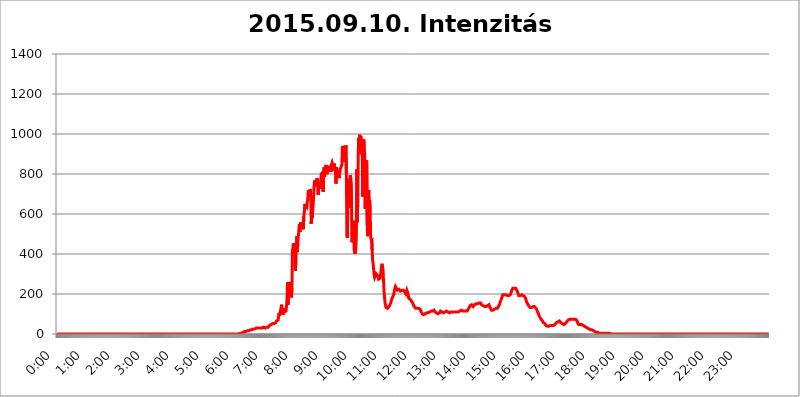
| Category | 2015.09.10. Intenzitás [W/m^2] |
|---|---|
| 0.0 | 0 |
| 0.0006944444444444445 | 0 |
| 0.001388888888888889 | 0 |
| 0.0020833333333333333 | 0 |
| 0.002777777777777778 | 0 |
| 0.003472222222222222 | 0 |
| 0.004166666666666667 | 0 |
| 0.004861111111111111 | 0 |
| 0.005555555555555556 | 0 |
| 0.0062499999999999995 | 0 |
| 0.006944444444444444 | 0 |
| 0.007638888888888889 | 0 |
| 0.008333333333333333 | 0 |
| 0.009027777777777779 | 0 |
| 0.009722222222222222 | 0 |
| 0.010416666666666666 | 0 |
| 0.011111111111111112 | 0 |
| 0.011805555555555555 | 0 |
| 0.012499999999999999 | 0 |
| 0.013194444444444444 | 0 |
| 0.013888888888888888 | 0 |
| 0.014583333333333332 | 0 |
| 0.015277777777777777 | 0 |
| 0.015972222222222224 | 0 |
| 0.016666666666666666 | 0 |
| 0.017361111111111112 | 0 |
| 0.018055555555555557 | 0 |
| 0.01875 | 0 |
| 0.019444444444444445 | 0 |
| 0.02013888888888889 | 0 |
| 0.020833333333333332 | 0 |
| 0.02152777777777778 | 0 |
| 0.022222222222222223 | 0 |
| 0.02291666666666667 | 0 |
| 0.02361111111111111 | 0 |
| 0.024305555555555556 | 0 |
| 0.024999999999999998 | 0 |
| 0.025694444444444447 | 0 |
| 0.02638888888888889 | 0 |
| 0.027083333333333334 | 0 |
| 0.027777777777777776 | 0 |
| 0.02847222222222222 | 0 |
| 0.029166666666666664 | 0 |
| 0.029861111111111113 | 0 |
| 0.030555555555555555 | 0 |
| 0.03125 | 0 |
| 0.03194444444444445 | 0 |
| 0.03263888888888889 | 0 |
| 0.03333333333333333 | 0 |
| 0.034027777777777775 | 0 |
| 0.034722222222222224 | 0 |
| 0.035416666666666666 | 0 |
| 0.036111111111111115 | 0 |
| 0.03680555555555556 | 0 |
| 0.0375 | 0 |
| 0.03819444444444444 | 0 |
| 0.03888888888888889 | 0 |
| 0.03958333333333333 | 0 |
| 0.04027777777777778 | 0 |
| 0.04097222222222222 | 0 |
| 0.041666666666666664 | 0 |
| 0.042361111111111106 | 0 |
| 0.04305555555555556 | 0 |
| 0.043750000000000004 | 0 |
| 0.044444444444444446 | 0 |
| 0.04513888888888889 | 0 |
| 0.04583333333333334 | 0 |
| 0.04652777777777778 | 0 |
| 0.04722222222222222 | 0 |
| 0.04791666666666666 | 0 |
| 0.04861111111111111 | 0 |
| 0.049305555555555554 | 0 |
| 0.049999999999999996 | 0 |
| 0.05069444444444445 | 0 |
| 0.051388888888888894 | 0 |
| 0.052083333333333336 | 0 |
| 0.05277777777777778 | 0 |
| 0.05347222222222222 | 0 |
| 0.05416666666666667 | 0 |
| 0.05486111111111111 | 0 |
| 0.05555555555555555 | 0 |
| 0.05625 | 0 |
| 0.05694444444444444 | 0 |
| 0.057638888888888885 | 0 |
| 0.05833333333333333 | 0 |
| 0.05902777777777778 | 0 |
| 0.059722222222222225 | 0 |
| 0.06041666666666667 | 0 |
| 0.061111111111111116 | 0 |
| 0.06180555555555556 | 0 |
| 0.0625 | 0 |
| 0.06319444444444444 | 0 |
| 0.06388888888888888 | 0 |
| 0.06458333333333334 | 0 |
| 0.06527777777777778 | 0 |
| 0.06597222222222222 | 0 |
| 0.06666666666666667 | 0 |
| 0.06736111111111111 | 0 |
| 0.06805555555555555 | 0 |
| 0.06874999999999999 | 0 |
| 0.06944444444444443 | 0 |
| 0.07013888888888889 | 0 |
| 0.07083333333333333 | 0 |
| 0.07152777777777779 | 0 |
| 0.07222222222222223 | 0 |
| 0.07291666666666667 | 0 |
| 0.07361111111111111 | 0 |
| 0.07430555555555556 | 0 |
| 0.075 | 0 |
| 0.07569444444444444 | 0 |
| 0.0763888888888889 | 0 |
| 0.07708333333333334 | 0 |
| 0.07777777777777778 | 0 |
| 0.07847222222222222 | 0 |
| 0.07916666666666666 | 0 |
| 0.0798611111111111 | 0 |
| 0.08055555555555556 | 0 |
| 0.08125 | 0 |
| 0.08194444444444444 | 0 |
| 0.08263888888888889 | 0 |
| 0.08333333333333333 | 0 |
| 0.08402777777777777 | 0 |
| 0.08472222222222221 | 0 |
| 0.08541666666666665 | 0 |
| 0.08611111111111112 | 0 |
| 0.08680555555555557 | 0 |
| 0.08750000000000001 | 0 |
| 0.08819444444444445 | 0 |
| 0.08888888888888889 | 0 |
| 0.08958333333333333 | 0 |
| 0.09027777777777778 | 0 |
| 0.09097222222222222 | 0 |
| 0.09166666666666667 | 0 |
| 0.09236111111111112 | 0 |
| 0.09305555555555556 | 0 |
| 0.09375 | 0 |
| 0.09444444444444444 | 0 |
| 0.09513888888888888 | 0 |
| 0.09583333333333333 | 0 |
| 0.09652777777777777 | 0 |
| 0.09722222222222222 | 0 |
| 0.09791666666666667 | 0 |
| 0.09861111111111111 | 0 |
| 0.09930555555555555 | 0 |
| 0.09999999999999999 | 0 |
| 0.10069444444444443 | 0 |
| 0.1013888888888889 | 0 |
| 0.10208333333333335 | 0 |
| 0.10277777777777779 | 0 |
| 0.10347222222222223 | 0 |
| 0.10416666666666667 | 0 |
| 0.10486111111111111 | 0 |
| 0.10555555555555556 | 0 |
| 0.10625 | 0 |
| 0.10694444444444444 | 0 |
| 0.1076388888888889 | 0 |
| 0.10833333333333334 | 0 |
| 0.10902777777777778 | 0 |
| 0.10972222222222222 | 0 |
| 0.1111111111111111 | 0 |
| 0.11180555555555556 | 0 |
| 0.11180555555555556 | 0 |
| 0.1125 | 0 |
| 0.11319444444444444 | 0 |
| 0.11388888888888889 | 0 |
| 0.11458333333333333 | 0 |
| 0.11527777777777777 | 0 |
| 0.11597222222222221 | 0 |
| 0.11666666666666665 | 0 |
| 0.1173611111111111 | 0 |
| 0.11805555555555557 | 0 |
| 0.11944444444444445 | 0 |
| 0.12013888888888889 | 0 |
| 0.12083333333333333 | 0 |
| 0.12152777777777778 | 0 |
| 0.12222222222222223 | 0 |
| 0.12291666666666667 | 0 |
| 0.12291666666666667 | 0 |
| 0.12361111111111112 | 0 |
| 0.12430555555555556 | 0 |
| 0.125 | 0 |
| 0.12569444444444444 | 0 |
| 0.12638888888888888 | 0 |
| 0.12708333333333333 | 0 |
| 0.16875 | 0 |
| 0.12847222222222224 | 0 |
| 0.12916666666666668 | 0 |
| 0.12986111111111112 | 0 |
| 0.13055555555555556 | 0 |
| 0.13125 | 0 |
| 0.13194444444444445 | 0 |
| 0.1326388888888889 | 0 |
| 0.13333333333333333 | 0 |
| 0.13402777777777777 | 0 |
| 0.13402777777777777 | 0 |
| 0.13472222222222222 | 0 |
| 0.13541666666666666 | 0 |
| 0.1361111111111111 | 0 |
| 0.13749999999999998 | 0 |
| 0.13819444444444443 | 0 |
| 0.1388888888888889 | 0 |
| 0.13958333333333334 | 0 |
| 0.14027777777777778 | 0 |
| 0.14097222222222222 | 0 |
| 0.14166666666666666 | 0 |
| 0.1423611111111111 | 0 |
| 0.14305555555555557 | 0 |
| 0.14375000000000002 | 0 |
| 0.14444444444444446 | 0 |
| 0.1451388888888889 | 0 |
| 0.1451388888888889 | 0 |
| 0.14652777777777778 | 0 |
| 0.14722222222222223 | 0 |
| 0.14791666666666667 | 0 |
| 0.1486111111111111 | 0 |
| 0.14930555555555555 | 0 |
| 0.15 | 0 |
| 0.15069444444444444 | 0 |
| 0.15138888888888888 | 0 |
| 0.15208333333333332 | 0 |
| 0.15277777777777776 | 0 |
| 0.15347222222222223 | 0 |
| 0.15416666666666667 | 0 |
| 0.15486111111111112 | 0 |
| 0.15555555555555556 | 0 |
| 0.15625 | 0 |
| 0.15694444444444444 | 0 |
| 0.15763888888888888 | 0 |
| 0.15833333333333333 | 0 |
| 0.15902777777777777 | 0 |
| 0.15972222222222224 | 0 |
| 0.16041666666666668 | 0 |
| 0.16111111111111112 | 0 |
| 0.16180555555555556 | 0 |
| 0.1625 | 0 |
| 0.16319444444444445 | 0 |
| 0.1638888888888889 | 0 |
| 0.16458333333333333 | 0 |
| 0.16527777777777777 | 0 |
| 0.16597222222222222 | 0 |
| 0.16666666666666666 | 0 |
| 0.1673611111111111 | 0 |
| 0.16805555555555554 | 0 |
| 0.16874999999999998 | 0 |
| 0.16944444444444443 | 0 |
| 0.17013888888888887 | 0 |
| 0.1708333333333333 | 0 |
| 0.17152777777777775 | 0 |
| 0.17222222222222225 | 0 |
| 0.1729166666666667 | 0 |
| 0.17361111111111113 | 0 |
| 0.17430555555555557 | 0 |
| 0.17500000000000002 | 0 |
| 0.17569444444444446 | 0 |
| 0.1763888888888889 | 0 |
| 0.17708333333333334 | 0 |
| 0.17777777777777778 | 0 |
| 0.17847222222222223 | 0 |
| 0.17916666666666667 | 0 |
| 0.1798611111111111 | 0 |
| 0.18055555555555555 | 0 |
| 0.18125 | 0 |
| 0.18194444444444444 | 0 |
| 0.1826388888888889 | 0 |
| 0.18333333333333335 | 0 |
| 0.1840277777777778 | 0 |
| 0.18472222222222223 | 0 |
| 0.18541666666666667 | 0 |
| 0.18611111111111112 | 0 |
| 0.18680555555555556 | 0 |
| 0.1875 | 0 |
| 0.18819444444444444 | 0 |
| 0.18888888888888888 | 0 |
| 0.18958333333333333 | 0 |
| 0.19027777777777777 | 0 |
| 0.1909722222222222 | 0 |
| 0.19166666666666665 | 0 |
| 0.19236111111111112 | 0 |
| 0.19305555555555554 | 0 |
| 0.19375 | 0 |
| 0.19444444444444445 | 0 |
| 0.1951388888888889 | 0 |
| 0.19583333333333333 | 0 |
| 0.19652777777777777 | 0 |
| 0.19722222222222222 | 0 |
| 0.19791666666666666 | 0 |
| 0.1986111111111111 | 0 |
| 0.19930555555555554 | 0 |
| 0.19999999999999998 | 0 |
| 0.20069444444444443 | 0 |
| 0.20138888888888887 | 0 |
| 0.2020833333333333 | 0 |
| 0.2027777777777778 | 0 |
| 0.2034722222222222 | 0 |
| 0.2041666666666667 | 0 |
| 0.20486111111111113 | 0 |
| 0.20555555555555557 | 0 |
| 0.20625000000000002 | 0 |
| 0.20694444444444446 | 0 |
| 0.2076388888888889 | 0 |
| 0.20833333333333334 | 0 |
| 0.20902777777777778 | 0 |
| 0.20972222222222223 | 0 |
| 0.21041666666666667 | 0 |
| 0.2111111111111111 | 0 |
| 0.21180555555555555 | 0 |
| 0.2125 | 0 |
| 0.21319444444444444 | 0 |
| 0.2138888888888889 | 0 |
| 0.21458333333333335 | 0 |
| 0.2152777777777778 | 0 |
| 0.21597222222222223 | 0 |
| 0.21666666666666667 | 0 |
| 0.21736111111111112 | 0 |
| 0.21805555555555556 | 0 |
| 0.21875 | 0 |
| 0.21944444444444444 | 0 |
| 0.22013888888888888 | 0 |
| 0.22083333333333333 | 0 |
| 0.22152777777777777 | 0 |
| 0.2222222222222222 | 0 |
| 0.22291666666666665 | 0 |
| 0.2236111111111111 | 0 |
| 0.22430555555555556 | 0 |
| 0.225 | 0 |
| 0.22569444444444445 | 0 |
| 0.2263888888888889 | 0 |
| 0.22708333333333333 | 0 |
| 0.22777777777777777 | 0 |
| 0.22847222222222222 | 0 |
| 0.22916666666666666 | 0 |
| 0.2298611111111111 | 0 |
| 0.23055555555555554 | 0 |
| 0.23124999999999998 | 0 |
| 0.23194444444444443 | 0 |
| 0.23263888888888887 | 0 |
| 0.2333333333333333 | 0 |
| 0.2340277777777778 | 0 |
| 0.2347222222222222 | 0 |
| 0.2354166666666667 | 0 |
| 0.23611111111111113 | 0 |
| 0.23680555555555557 | 0 |
| 0.23750000000000002 | 0 |
| 0.23819444444444446 | 0 |
| 0.2388888888888889 | 0 |
| 0.23958333333333334 | 0 |
| 0.24027777777777778 | 0 |
| 0.24097222222222223 | 0 |
| 0.24166666666666667 | 0 |
| 0.2423611111111111 | 0 |
| 0.24305555555555555 | 0 |
| 0.24375 | 0 |
| 0.24444444444444446 | 0 |
| 0.24513888888888888 | 0 |
| 0.24583333333333335 | 0 |
| 0.2465277777777778 | 0 |
| 0.24722222222222223 | 0 |
| 0.24791666666666667 | 0 |
| 0.24861111111111112 | 0 |
| 0.24930555555555556 | 0 |
| 0.25 | 0 |
| 0.25069444444444444 | 0 |
| 0.2513888888888889 | 0 |
| 0.2520833333333333 | 0 |
| 0.25277777777777777 | 0 |
| 0.2534722222222222 | 0 |
| 0.25416666666666665 | 0 |
| 0.2548611111111111 | 0 |
| 0.2555555555555556 | 0 |
| 0.25625000000000003 | 3.525 |
| 0.2569444444444445 | 3.525 |
| 0.2576388888888889 | 3.525 |
| 0.25833333333333336 | 3.525 |
| 0.2590277777777778 | 3.525 |
| 0.25972222222222224 | 7.887 |
| 0.2604166666666667 | 7.887 |
| 0.2611111111111111 | 7.887 |
| 0.26180555555555557 | 7.887 |
| 0.2625 | 12.257 |
| 0.26319444444444445 | 12.257 |
| 0.2638888888888889 | 12.257 |
| 0.26458333333333334 | 12.257 |
| 0.2652777777777778 | 12.257 |
| 0.2659722222222222 | 16.636 |
| 0.26666666666666666 | 16.636 |
| 0.2673611111111111 | 16.636 |
| 0.26805555555555555 | 16.636 |
| 0.26875 | 16.636 |
| 0.26944444444444443 | 16.636 |
| 0.2701388888888889 | 21.024 |
| 0.2708333333333333 | 21.024 |
| 0.27152777777777776 | 21.024 |
| 0.2722222222222222 | 21.024 |
| 0.27291666666666664 | 21.024 |
| 0.2736111111111111 | 21.024 |
| 0.2743055555555555 | 21.024 |
| 0.27499999999999997 | 25.419 |
| 0.27569444444444446 | 25.419 |
| 0.27638888888888885 | 25.419 |
| 0.27708333333333335 | 25.419 |
| 0.2777777777777778 | 25.419 |
| 0.27847222222222223 | 25.419 |
| 0.2791666666666667 | 29.823 |
| 0.2798611111111111 | 29.823 |
| 0.28055555555555556 | 29.823 |
| 0.28125 | 29.823 |
| 0.28194444444444444 | 29.823 |
| 0.2826388888888889 | 29.823 |
| 0.2833333333333333 | 29.823 |
| 0.28402777777777777 | 29.823 |
| 0.2847222222222222 | 29.823 |
| 0.28541666666666665 | 29.823 |
| 0.28611111111111115 | 29.823 |
| 0.28680555555555554 | 29.823 |
| 0.28750000000000003 | 29.823 |
| 0.2881944444444445 | 29.823 |
| 0.2888888888888889 | 29.823 |
| 0.28958333333333336 | 34.234 |
| 0.2902777777777778 | 34.234 |
| 0.29097222222222224 | 29.823 |
| 0.2916666666666667 | 29.823 |
| 0.2923611111111111 | 34.234 |
| 0.29305555555555557 | 34.234 |
| 0.29375 | 34.234 |
| 0.29444444444444445 | 34.234 |
| 0.2951388888888889 | 34.234 |
| 0.29583333333333334 | 34.234 |
| 0.2965277777777778 | 38.653 |
| 0.2972222222222222 | 38.653 |
| 0.29791666666666666 | 43.079 |
| 0.2986111111111111 | 47.511 |
| 0.29930555555555555 | 47.511 |
| 0.3 | 47.511 |
| 0.30069444444444443 | 51.951 |
| 0.3013888888888889 | 47.511 |
| 0.3020833333333333 | 51.951 |
| 0.30277777777777776 | 51.951 |
| 0.3034722222222222 | 51.951 |
| 0.30416666666666664 | 51.951 |
| 0.3048611111111111 | 56.398 |
| 0.3055555555555555 | 56.398 |
| 0.30624999999999997 | 56.398 |
| 0.3069444444444444 | 56.398 |
| 0.3076388888888889 | 65.31 |
| 0.30833333333333335 | 65.31 |
| 0.3090277777777778 | 65.31 |
| 0.30972222222222223 | 69.775 |
| 0.3104166666666667 | 87.692 |
| 0.3111111111111111 | 105.69 |
| 0.31180555555555556 | 92.184 |
| 0.3125 | 96.682 |
| 0.31319444444444444 | 114.716 |
| 0.3138888888888889 | 110.201 |
| 0.3145833333333333 | 146.423 |
| 0.31527777777777777 | 123.758 |
| 0.3159722222222222 | 114.716 |
| 0.31666666666666665 | 96.682 |
| 0.31736111111111115 | 96.682 |
| 0.31805555555555554 | 128.284 |
| 0.31875000000000003 | 110.201 |
| 0.3194444444444445 | 105.69 |
| 0.3201388888888889 | 110.201 |
| 0.32083333333333336 | 114.716 |
| 0.3215277777777778 | 137.347 |
| 0.32222222222222224 | 169.156 |
| 0.3229166666666667 | 260.373 |
| 0.3236111111111111 | 146.423 |
| 0.32430555555555557 | 173.709 |
| 0.325 | 210.182 |
| 0.32569444444444445 | 219.309 |
| 0.3263888888888889 | 233 |
| 0.32708333333333334 | 260.373 |
| 0.3277777777777778 | 223.873 |
| 0.3284722222222222 | 182.82 |
| 0.32916666666666666 | 228.436 |
| 0.3298611111111111 | 422.943 |
| 0.33055555555555555 | 409.574 |
| 0.33125 | 453.968 |
| 0.33194444444444443 | 405.108 |
| 0.3326388888888889 | 422.943 |
| 0.3333333333333333 | 409.574 |
| 0.3340277777777778 | 314.98 |
| 0.3347222222222222 | 378.224 |
| 0.3354166666666667 | 378.224 |
| 0.3361111111111111 | 489.108 |
| 0.3368055555555556 | 409.574 |
| 0.33749999999999997 | 471.582 |
| 0.33819444444444446 | 489.108 |
| 0.33888888888888885 | 484.735 |
| 0.33958333333333335 | 549.704 |
| 0.34027777777777773 | 510.885 |
| 0.34097222222222223 | 549.704 |
| 0.3416666666666666 | 558.261 |
| 0.3423611111111111 | 532.513 |
| 0.3430555555555555 | 532.513 |
| 0.34375 | 528.2 |
| 0.3444444444444445 | 549.704 |
| 0.3451388888888889 | 523.88 |
| 0.3458333333333334 | 588.009 |
| 0.34652777777777777 | 609.062 |
| 0.34722222222222227 | 650.667 |
| 0.34791666666666665 | 642.4 |
| 0.34861111111111115 | 642.4 |
| 0.34930555555555554 | 638.256 |
| 0.35000000000000003 | 634.105 |
| 0.3506944444444444 | 658.909 |
| 0.3513888888888889 | 675.311 |
| 0.3520833333333333 | 719.877 |
| 0.3527777777777778 | 711.832 |
| 0.3534722222222222 | 715.858 |
| 0.3541666666666667 | 687.544 |
| 0.3548611111111111 | 723.889 |
| 0.35555555555555557 | 699.717 |
| 0.35625 | 549.704 |
| 0.35694444444444445 | 613.252 |
| 0.3576388888888889 | 579.542 |
| 0.35833333333333334 | 621.613 |
| 0.3590277777777778 | 650.667 |
| 0.3597222222222222 | 699.717 |
| 0.36041666666666666 | 751.803 |
| 0.3611111111111111 | 767.62 |
| 0.36180555555555555 | 767.62 |
| 0.3625 | 735.89 |
| 0.36319444444444443 | 763.674 |
| 0.3638888888888889 | 771.559 |
| 0.3645833333333333 | 779.42 |
| 0.3652777777777778 | 759.723 |
| 0.3659722222222222 | 695.666 |
| 0.3666666666666667 | 759.723 |
| 0.3673611111111111 | 727.896 |
| 0.3680555555555556 | 759.723 |
| 0.36874999999999997 | 727.896 |
| 0.36944444444444446 | 751.803 |
| 0.37013888888888885 | 795.074 |
| 0.37083333333333335 | 806.757 |
| 0.37152777777777773 | 798.974 |
| 0.37222222222222223 | 810.641 |
| 0.3729166666666666 | 711.832 |
| 0.3736111111111111 | 814.519 |
| 0.3743055555555555 | 833.834 |
| 0.375 | 787.258 |
| 0.3756944444444445 | 826.123 |
| 0.3763888888888889 | 837.682 |
| 0.3770833333333334 | 845.365 |
| 0.37777777777777777 | 829.981 |
| 0.37847222222222227 | 798.974 |
| 0.37916666666666665 | 826.123 |
| 0.37986111111111115 | 810.641 |
| 0.38055555555555554 | 833.834 |
| 0.38125000000000003 | 833.834 |
| 0.3819444444444444 | 837.682 |
| 0.3826388888888889 | 837.682 |
| 0.3833333333333333 | 833.834 |
| 0.3840277777777778 | 810.641 |
| 0.3847222222222222 | 849.199 |
| 0.3854166666666667 | 856.855 |
| 0.3861111111111111 | 853.029 |
| 0.38680555555555557 | 837.682 |
| 0.3875 | 833.834 |
| 0.38819444444444445 | 853.029 |
| 0.3888888888888889 | 849.199 |
| 0.38958333333333334 | 849.199 |
| 0.3902777777777778 | 810.641 |
| 0.3909722222222222 | 751.803 |
| 0.39166666666666666 | 833.834 |
| 0.3923611111111111 | 822.26 |
| 0.39305555555555555 | 810.641 |
| 0.39375 | 783.342 |
| 0.39444444444444443 | 802.868 |
| 0.3951388888888889 | 779.42 |
| 0.3958333333333333 | 783.342 |
| 0.3965277777777778 | 818.392 |
| 0.3972222222222222 | 814.519 |
| 0.3979166666666667 | 833.834 |
| 0.3986111111111111 | 837.682 |
| 0.3993055555555556 | 849.199 |
| 0.39999999999999997 | 940.082 |
| 0.40069444444444446 | 943.832 |
| 0.40138888888888885 | 925.06 |
| 0.40208333333333335 | 879.719 |
| 0.40277777777777773 | 860.676 |
| 0.40347222222222223 | 887.309 |
| 0.4041666666666666 | 921.298 |
| 0.4048611111111111 | 943.832 |
| 0.4055555555555555 | 798.974 |
| 0.40625 | 489.108 |
| 0.4069444444444445 | 480.356 |
| 0.4076388888888889 | 775.492 |
| 0.4083333333333334 | 751.803 |
| 0.40902777777777777 | 629.948 |
| 0.40972222222222227 | 667.123 |
| 0.41041666666666665 | 759.723 |
| 0.41111111111111115 | 795.074 |
| 0.41180555555555554 | 771.559 |
| 0.41250000000000003 | 747.834 |
| 0.4131944444444444 | 458.38 |
| 0.4138888888888889 | 453.968 |
| 0.4145833333333333 | 458.38 |
| 0.4152777777777778 | 480.356 |
| 0.4159722222222222 | 566.793 |
| 0.4166666666666667 | 418.492 |
| 0.4173611111111111 | 400.638 |
| 0.41805555555555557 | 405.108 |
| 0.41875 | 422.943 |
| 0.41944444444444445 | 484.735 |
| 0.4201388888888889 | 822.26 |
| 0.42083333333333334 | 558.261 |
| 0.4215277777777778 | 675.311 |
| 0.4222222222222222 | 909.996 |
| 0.42291666666666666 | 981.244 |
| 0.4236111111111111 | 909.996 |
| 0.42430555555555555 | 996.182 |
| 0.425 | 909.996 |
| 0.42569444444444443 | 988.714 |
| 0.4263888888888889 | 898.668 |
| 0.4270833333333333 | 970.034 |
| 0.4277777777777778 | 951.327 |
| 0.4284722222222222 | 687.544 |
| 0.4291666666666667 | 958.814 |
| 0.4298611111111111 | 973.772 |
| 0.4305555555555556 | 932.576 |
| 0.43124999999999997 | 894.885 |
| 0.43194444444444446 | 625.784 |
| 0.43263888888888885 | 849.199 |
| 0.43333333333333335 | 845.365 |
| 0.43402777777777773 | 868.305 |
| 0.43472222222222223 | 545.416 |
| 0.4354166666666666 | 489.108 |
| 0.4361111111111111 | 489.108 |
| 0.4368055555555555 | 719.877 |
| 0.4375 | 629.948 |
| 0.4381944444444445 | 667.123 |
| 0.4388888888888889 | 609.062 |
| 0.4395833333333334 | 484.735 |
| 0.44027777777777777 | 471.582 |
| 0.44097222222222227 | 480.356 |
| 0.44166666666666665 | 418.492 |
| 0.44236111111111115 | 369.23 |
| 0.44305555555555554 | 351.198 |
| 0.44375000000000003 | 324.052 |
| 0.4444444444444444 | 296.808 |
| 0.4451388888888889 | 283.156 |
| 0.4458333333333333 | 278.603 |
| 0.4465277777777778 | 287.709 |
| 0.4472222222222222 | 301.354 |
| 0.4479166666666667 | 301.354 |
| 0.4486111111111111 | 301.354 |
| 0.44930555555555557 | 292.259 |
| 0.45 | 287.709 |
| 0.45069444444444445 | 274.047 |
| 0.4513888888888889 | 274.047 |
| 0.45208333333333334 | 274.047 |
| 0.4527777777777778 | 278.603 |
| 0.4534722222222222 | 296.808 |
| 0.45416666666666666 | 314.98 |
| 0.4548611111111111 | 337.639 |
| 0.45555555555555555 | 351.198 |
| 0.45625 | 351.198 |
| 0.45694444444444443 | 314.98 |
| 0.4576388888888889 | 264.932 |
| 0.4583333333333333 | 214.746 |
| 0.4590277777777778 | 182.82 |
| 0.4597222222222222 | 160.056 |
| 0.4604166666666667 | 146.423 |
| 0.4611111111111111 | 132.814 |
| 0.4618055555555556 | 128.284 |
| 0.46249999999999997 | 128.284 |
| 0.46319444444444446 | 128.284 |
| 0.46388888888888885 | 128.284 |
| 0.46458333333333335 | 132.814 |
| 0.46527777777777773 | 137.347 |
| 0.46597222222222223 | 141.884 |
| 0.4666666666666666 | 146.423 |
| 0.4673611111111111 | 150.964 |
| 0.4680555555555555 | 160.056 |
| 0.46875 | 169.156 |
| 0.4694444444444445 | 178.264 |
| 0.4701388888888889 | 182.82 |
| 0.4708333333333334 | 187.378 |
| 0.47152777777777777 | 191.937 |
| 0.47222222222222227 | 201.058 |
| 0.47291666666666665 | 219.309 |
| 0.47361111111111115 | 228.436 |
| 0.47430555555555554 | 237.564 |
| 0.47500000000000003 | 233 |
| 0.4756944444444444 | 228.436 |
| 0.4763888888888889 | 228.436 |
| 0.4770833333333333 | 219.309 |
| 0.4777777777777778 | 214.746 |
| 0.4784722222222222 | 219.309 |
| 0.4791666666666667 | 223.873 |
| 0.4798611111111111 | 223.873 |
| 0.48055555555555557 | 219.309 |
| 0.48125 | 214.746 |
| 0.48194444444444445 | 214.746 |
| 0.4826388888888889 | 219.309 |
| 0.48333333333333334 | 219.309 |
| 0.4840277777777778 | 219.309 |
| 0.4847222222222222 | 219.309 |
| 0.48541666666666666 | 219.309 |
| 0.4861111111111111 | 219.309 |
| 0.48680555555555555 | 219.309 |
| 0.4875 | 210.182 |
| 0.48819444444444443 | 205.62 |
| 0.4888888888888889 | 201.058 |
| 0.4895833333333333 | 210.182 |
| 0.4902777777777778 | 219.309 |
| 0.4909722222222222 | 214.746 |
| 0.4916666666666667 | 205.62 |
| 0.4923611111111111 | 191.937 |
| 0.4930555555555556 | 178.264 |
| 0.49374999999999997 | 173.709 |
| 0.49444444444444446 | 173.709 |
| 0.49513888888888885 | 173.709 |
| 0.49583333333333335 | 169.156 |
| 0.49652777777777773 | 164.605 |
| 0.49722222222222223 | 164.605 |
| 0.4979166666666666 | 160.056 |
| 0.4986111111111111 | 155.509 |
| 0.4993055555555555 | 146.423 |
| 0.5 | 141.884 |
| 0.5006944444444444 | 137.347 |
| 0.5013888888888889 | 137.347 |
| 0.5020833333333333 | 132.814 |
| 0.5027777777777778 | 128.284 |
| 0.5034722222222222 | 128.284 |
| 0.5041666666666667 | 128.284 |
| 0.5048611111111111 | 128.284 |
| 0.5055555555555555 | 128.284 |
| 0.50625 | 128.284 |
| 0.5069444444444444 | 128.284 |
| 0.5076388888888889 | 128.284 |
| 0.5083333333333333 | 128.284 |
| 0.5090277777777777 | 123.758 |
| 0.5097222222222222 | 119.235 |
| 0.5104166666666666 | 110.201 |
| 0.5111111111111112 | 105.69 |
| 0.5118055555555555 | 101.184 |
| 0.5125000000000001 | 96.682 |
| 0.5131944444444444 | 96.682 |
| 0.513888888888889 | 96.682 |
| 0.5145833333333333 | 96.682 |
| 0.5152777777777778 | 101.184 |
| 0.5159722222222222 | 101.184 |
| 0.5166666666666667 | 105.69 |
| 0.517361111111111 | 105.69 |
| 0.5180555555555556 | 105.69 |
| 0.5187499999999999 | 105.69 |
| 0.5194444444444445 | 105.69 |
| 0.5201388888888888 | 105.69 |
| 0.5208333333333334 | 105.69 |
| 0.5215277777777778 | 110.201 |
| 0.5222222222222223 | 110.201 |
| 0.5229166666666667 | 110.201 |
| 0.5236111111111111 | 114.716 |
| 0.5243055555555556 | 114.716 |
| 0.525 | 110.201 |
| 0.5256944444444445 | 110.201 |
| 0.5263888888888889 | 114.716 |
| 0.5270833333333333 | 114.716 |
| 0.5277777777777778 | 119.235 |
| 0.5284722222222222 | 119.235 |
| 0.5291666666666667 | 114.716 |
| 0.5298611111111111 | 110.201 |
| 0.5305555555555556 | 110.201 |
| 0.53125 | 110.201 |
| 0.5319444444444444 | 105.69 |
| 0.5326388888888889 | 105.69 |
| 0.5333333333333333 | 101.184 |
| 0.5340277777777778 | 101.184 |
| 0.5347222222222222 | 101.184 |
| 0.5354166666666667 | 101.184 |
| 0.5361111111111111 | 105.69 |
| 0.5368055555555555 | 110.201 |
| 0.5375 | 114.716 |
| 0.5381944444444444 | 114.716 |
| 0.5388888888888889 | 110.201 |
| 0.5395833333333333 | 110.201 |
| 0.5402777777777777 | 105.69 |
| 0.5409722222222222 | 105.69 |
| 0.5416666666666666 | 105.69 |
| 0.5423611111111112 | 105.69 |
| 0.5430555555555555 | 110.201 |
| 0.5437500000000001 | 110.201 |
| 0.5444444444444444 | 110.201 |
| 0.545138888888889 | 110.201 |
| 0.5458333333333333 | 114.716 |
| 0.5465277777777778 | 114.716 |
| 0.5472222222222222 | 114.716 |
| 0.5479166666666667 | 110.201 |
| 0.548611111111111 | 105.69 |
| 0.5493055555555556 | 105.69 |
| 0.5499999999999999 | 105.69 |
| 0.5506944444444445 | 110.201 |
| 0.5513888888888888 | 110.201 |
| 0.5520833333333334 | 110.201 |
| 0.5527777777777778 | 114.716 |
| 0.5534722222222223 | 114.716 |
| 0.5541666666666667 | 110.201 |
| 0.5548611111111111 | 110.201 |
| 0.5555555555555556 | 110.201 |
| 0.55625 | 110.201 |
| 0.5569444444444445 | 110.201 |
| 0.5576388888888889 | 110.201 |
| 0.5583333333333333 | 110.201 |
| 0.5590277777777778 | 110.201 |
| 0.5597222222222222 | 110.201 |
| 0.5604166666666667 | 110.201 |
| 0.5611111111111111 | 110.201 |
| 0.5618055555555556 | 110.201 |
| 0.5625 | 110.201 |
| 0.5631944444444444 | 110.201 |
| 0.5638888888888889 | 114.716 |
| 0.5645833333333333 | 114.716 |
| 0.5652777777777778 | 114.716 |
| 0.5659722222222222 | 119.235 |
| 0.5666666666666667 | 119.235 |
| 0.5673611111111111 | 119.235 |
| 0.5680555555555555 | 119.235 |
| 0.56875 | 114.716 |
| 0.5694444444444444 | 114.716 |
| 0.5701388888888889 | 114.716 |
| 0.5708333333333333 | 114.716 |
| 0.5715277777777777 | 114.716 |
| 0.5722222222222222 | 114.716 |
| 0.5729166666666666 | 114.716 |
| 0.5736111111111112 | 114.716 |
| 0.5743055555555555 | 114.716 |
| 0.5750000000000001 | 114.716 |
| 0.5756944444444444 | 119.235 |
| 0.576388888888889 | 123.758 |
| 0.5770833333333333 | 128.284 |
| 0.5777777777777778 | 132.814 |
| 0.5784722222222222 | 137.347 |
| 0.5791666666666667 | 141.884 |
| 0.579861111111111 | 141.884 |
| 0.5805555555555556 | 146.423 |
| 0.5812499999999999 | 146.423 |
| 0.5819444444444445 | 146.423 |
| 0.5826388888888888 | 141.884 |
| 0.5833333333333334 | 137.347 |
| 0.5840277777777778 | 137.347 |
| 0.5847222222222223 | 141.884 |
| 0.5854166666666667 | 146.423 |
| 0.5861111111111111 | 146.423 |
| 0.5868055555555556 | 150.964 |
| 0.5875 | 150.964 |
| 0.5881944444444445 | 150.964 |
| 0.5888888888888889 | 150.964 |
| 0.5895833333333333 | 150.964 |
| 0.5902777777777778 | 146.423 |
| 0.5909722222222222 | 150.964 |
| 0.5916666666666667 | 155.509 |
| 0.5923611111111111 | 160.056 |
| 0.5930555555555556 | 155.509 |
| 0.59375 | 155.509 |
| 0.5944444444444444 | 150.964 |
| 0.5951388888888889 | 146.423 |
| 0.5958333333333333 | 141.884 |
| 0.5965277777777778 | 141.884 |
| 0.5972222222222222 | 141.884 |
| 0.5979166666666667 | 141.884 |
| 0.5986111111111111 | 137.347 |
| 0.5993055555555555 | 137.347 |
| 0.6 | 137.347 |
| 0.6006944444444444 | 137.347 |
| 0.6013888888888889 | 137.347 |
| 0.6020833333333333 | 137.347 |
| 0.6027777777777777 | 137.347 |
| 0.6034722222222222 | 141.884 |
| 0.6041666666666666 | 146.423 |
| 0.6048611111111112 | 146.423 |
| 0.6055555555555555 | 146.423 |
| 0.6062500000000001 | 137.347 |
| 0.6069444444444444 | 137.347 |
| 0.607638888888889 | 128.284 |
| 0.6083333333333333 | 123.758 |
| 0.6090277777777778 | 119.235 |
| 0.6097222222222222 | 119.235 |
| 0.6104166666666667 | 119.235 |
| 0.611111111111111 | 119.235 |
| 0.6118055555555556 | 119.235 |
| 0.6124999999999999 | 123.758 |
| 0.6131944444444445 | 123.758 |
| 0.6138888888888888 | 128.284 |
| 0.6145833333333334 | 128.284 |
| 0.6152777777777778 | 128.284 |
| 0.6159722222222223 | 128.284 |
| 0.6166666666666667 | 128.284 |
| 0.6173611111111111 | 128.284 |
| 0.6180555555555556 | 132.814 |
| 0.61875 | 137.347 |
| 0.6194444444444445 | 141.884 |
| 0.6201388888888889 | 146.423 |
| 0.6208333333333333 | 155.509 |
| 0.6215277777777778 | 160.056 |
| 0.6222222222222222 | 169.156 |
| 0.6229166666666667 | 173.709 |
| 0.6236111111111111 | 182.82 |
| 0.6243055555555556 | 187.378 |
| 0.625 | 196.497 |
| 0.6256944444444444 | 196.497 |
| 0.6263888888888889 | 201.058 |
| 0.6270833333333333 | 196.497 |
| 0.6277777777777778 | 196.497 |
| 0.6284722222222222 | 196.497 |
| 0.6291666666666667 | 196.497 |
| 0.6298611111111111 | 196.497 |
| 0.6305555555555555 | 191.937 |
| 0.63125 | 191.937 |
| 0.6319444444444444 | 187.378 |
| 0.6326388888888889 | 191.937 |
| 0.6333333333333333 | 191.937 |
| 0.6340277777777777 | 191.937 |
| 0.6347222222222222 | 191.937 |
| 0.6354166666666666 | 196.497 |
| 0.6361111111111112 | 201.058 |
| 0.6368055555555555 | 210.182 |
| 0.6375000000000001 | 219.309 |
| 0.6381944444444444 | 223.873 |
| 0.638888888888889 | 228.436 |
| 0.6395833333333333 | 228.436 |
| 0.6402777777777778 | 228.436 |
| 0.6409722222222222 | 228.436 |
| 0.6416666666666667 | 228.436 |
| 0.642361111111111 | 228.436 |
| 0.6430555555555556 | 228.436 |
| 0.6437499999999999 | 228.436 |
| 0.6444444444444445 | 223.873 |
| 0.6451388888888888 | 214.746 |
| 0.6458333333333334 | 210.182 |
| 0.6465277777777778 | 201.058 |
| 0.6472222222222223 | 191.937 |
| 0.6479166666666667 | 191.937 |
| 0.6486111111111111 | 187.378 |
| 0.6493055555555556 | 191.937 |
| 0.65 | 191.937 |
| 0.6506944444444445 | 191.937 |
| 0.6513888888888889 | 196.497 |
| 0.6520833333333333 | 196.497 |
| 0.6527777777777778 | 196.497 |
| 0.6534722222222222 | 191.937 |
| 0.6541666666666667 | 191.937 |
| 0.6548611111111111 | 191.937 |
| 0.6555555555555556 | 187.378 |
| 0.65625 | 182.82 |
| 0.6569444444444444 | 178.264 |
| 0.6576388888888889 | 169.156 |
| 0.6583333333333333 | 160.056 |
| 0.6590277777777778 | 155.509 |
| 0.6597222222222222 | 150.964 |
| 0.6604166666666667 | 146.423 |
| 0.6611111111111111 | 141.884 |
| 0.6618055555555555 | 137.347 |
| 0.6625 | 137.347 |
| 0.6631944444444444 | 132.814 |
| 0.6638888888888889 | 132.814 |
| 0.6645833333333333 | 132.814 |
| 0.6652777777777777 | 132.814 |
| 0.6659722222222222 | 132.814 |
| 0.6666666666666666 | 137.347 |
| 0.6673611111111111 | 137.347 |
| 0.6680555555555556 | 141.884 |
| 0.6687500000000001 | 137.347 |
| 0.6694444444444444 | 137.347 |
| 0.6701388888888888 | 137.347 |
| 0.6708333333333334 | 132.814 |
| 0.6715277777777778 | 128.284 |
| 0.6722222222222222 | 123.758 |
| 0.6729166666666666 | 119.235 |
| 0.6736111111111112 | 110.201 |
| 0.6743055555555556 | 105.69 |
| 0.6749999999999999 | 101.184 |
| 0.6756944444444444 | 92.184 |
| 0.6763888888888889 | 87.692 |
| 0.6770833333333334 | 83.205 |
| 0.6777777777777777 | 78.722 |
| 0.6784722222222223 | 74.246 |
| 0.6791666666666667 | 74.246 |
| 0.6798611111111111 | 69.775 |
| 0.6805555555555555 | 65.31 |
| 0.68125 | 60.85 |
| 0.6819444444444445 | 56.398 |
| 0.6826388888888889 | 56.398 |
| 0.6833333333333332 | 51.951 |
| 0.6840277777777778 | 51.951 |
| 0.6847222222222222 | 47.511 |
| 0.6854166666666667 | 43.079 |
| 0.686111111111111 | 38.653 |
| 0.6868055555555556 | 38.653 |
| 0.6875 | 38.653 |
| 0.6881944444444444 | 38.653 |
| 0.688888888888889 | 38.653 |
| 0.6895833333333333 | 38.653 |
| 0.6902777777777778 | 38.653 |
| 0.6909722222222222 | 43.079 |
| 0.6916666666666668 | 43.079 |
| 0.6923611111111111 | 43.079 |
| 0.6930555555555555 | 43.079 |
| 0.69375 | 43.079 |
| 0.6944444444444445 | 43.079 |
| 0.6951388888888889 | 43.079 |
| 0.6958333333333333 | 43.079 |
| 0.6965277777777777 | 43.079 |
| 0.6972222222222223 | 47.511 |
| 0.6979166666666666 | 47.511 |
| 0.6986111111111111 | 51.951 |
| 0.6993055555555556 | 51.951 |
| 0.7000000000000001 | 56.398 |
| 0.7006944444444444 | 56.398 |
| 0.7013888888888888 | 60.85 |
| 0.7020833333333334 | 60.85 |
| 0.7027777777777778 | 65.31 |
| 0.7034722222222222 | 65.31 |
| 0.7041666666666666 | 65.31 |
| 0.7048611111111112 | 65.31 |
| 0.7055555555555556 | 60.85 |
| 0.7062499999999999 | 56.398 |
| 0.7069444444444444 | 56.398 |
| 0.7076388888888889 | 51.951 |
| 0.7083333333333334 | 51.951 |
| 0.7090277777777777 | 47.511 |
| 0.7097222222222223 | 47.511 |
| 0.7104166666666667 | 47.511 |
| 0.7111111111111111 | 47.511 |
| 0.7118055555555555 | 47.511 |
| 0.7125 | 51.951 |
| 0.7131944444444445 | 56.398 |
| 0.7138888888888889 | 56.398 |
| 0.7145833333333332 | 60.85 |
| 0.7152777777777778 | 65.31 |
| 0.7159722222222222 | 65.31 |
| 0.7166666666666667 | 69.775 |
| 0.717361111111111 | 74.246 |
| 0.7180555555555556 | 74.246 |
| 0.71875 | 74.246 |
| 0.7194444444444444 | 74.246 |
| 0.720138888888889 | 74.246 |
| 0.7208333333333333 | 74.246 |
| 0.7215277777777778 | 74.246 |
| 0.7222222222222222 | 74.246 |
| 0.7229166666666668 | 74.246 |
| 0.7236111111111111 | 74.246 |
| 0.7243055555555555 | 74.246 |
| 0.725 | 74.246 |
| 0.7256944444444445 | 78.722 |
| 0.7263888888888889 | 74.246 |
| 0.7270833333333333 | 74.246 |
| 0.7277777777777777 | 74.246 |
| 0.7284722222222223 | 69.775 |
| 0.7291666666666666 | 65.31 |
| 0.7298611111111111 | 56.398 |
| 0.7305555555555556 | 51.951 |
| 0.7312500000000001 | 47.511 |
| 0.7319444444444444 | 43.079 |
| 0.7326388888888888 | 43.079 |
| 0.7333333333333334 | 47.511 |
| 0.7340277777777778 | 47.511 |
| 0.7347222222222222 | 47.511 |
| 0.7354166666666666 | 47.511 |
| 0.7361111111111112 | 43.079 |
| 0.7368055555555556 | 43.079 |
| 0.7374999999999999 | 43.079 |
| 0.7381944444444444 | 38.653 |
| 0.7388888888888889 | 38.653 |
| 0.7395833333333334 | 38.653 |
| 0.7402777777777777 | 38.653 |
| 0.7409722222222223 | 38.653 |
| 0.7416666666666667 | 34.234 |
| 0.7423611111111111 | 34.234 |
| 0.7430555555555555 | 29.823 |
| 0.74375 | 29.823 |
| 0.7444444444444445 | 29.823 |
| 0.7451388888888889 | 29.823 |
| 0.7458333333333332 | 25.419 |
| 0.7465277777777778 | 25.419 |
| 0.7472222222222222 | 25.419 |
| 0.7479166666666667 | 21.024 |
| 0.748611111111111 | 21.024 |
| 0.7493055555555556 | 21.024 |
| 0.75 | 21.024 |
| 0.7506944444444444 | 16.636 |
| 0.751388888888889 | 16.636 |
| 0.7520833333333333 | 16.636 |
| 0.7527777777777778 | 12.257 |
| 0.7534722222222222 | 12.257 |
| 0.7541666666666668 | 12.257 |
| 0.7548611111111111 | 12.257 |
| 0.7555555555555555 | 7.887 |
| 0.75625 | 7.887 |
| 0.7569444444444445 | 7.887 |
| 0.7576388888888889 | 7.887 |
| 0.7583333333333333 | 7.887 |
| 0.7590277777777777 | 3.525 |
| 0.7597222222222223 | 3.525 |
| 0.7604166666666666 | 3.525 |
| 0.7611111111111111 | 3.525 |
| 0.7618055555555556 | 3.525 |
| 0.7625000000000001 | 3.525 |
| 0.7631944444444444 | 3.525 |
| 0.7638888888888888 | 3.525 |
| 0.7645833333333334 | 3.525 |
| 0.7652777777777778 | 3.525 |
| 0.7659722222222222 | 3.525 |
| 0.7666666666666666 | 3.525 |
| 0.7673611111111112 | 3.525 |
| 0.7680555555555556 | 3.525 |
| 0.7687499999999999 | 3.525 |
| 0.7694444444444444 | 3.525 |
| 0.7701388888888889 | 3.525 |
| 0.7708333333333334 | 3.525 |
| 0.7715277777777777 | 3.525 |
| 0.7722222222222223 | 3.525 |
| 0.7729166666666667 | 3.525 |
| 0.7736111111111111 | 3.525 |
| 0.7743055555555555 | 3.525 |
| 0.775 | 3.525 |
| 0.7756944444444445 | 3.525 |
| 0.7763888888888889 | 0 |
| 0.7770833333333332 | 0 |
| 0.7777777777777778 | 0 |
| 0.7784722222222222 | 0 |
| 0.7791666666666667 | 0 |
| 0.779861111111111 | 0 |
| 0.7805555555555556 | 0 |
| 0.78125 | 0 |
| 0.7819444444444444 | 0 |
| 0.782638888888889 | 0 |
| 0.7833333333333333 | 0 |
| 0.7840277777777778 | 0 |
| 0.7847222222222222 | 0 |
| 0.7854166666666668 | 0 |
| 0.7861111111111111 | 0 |
| 0.7868055555555555 | 0 |
| 0.7875 | 0 |
| 0.7881944444444445 | 0 |
| 0.7888888888888889 | 0 |
| 0.7895833333333333 | 0 |
| 0.7902777777777777 | 0 |
| 0.7909722222222223 | 0 |
| 0.7916666666666666 | 0 |
| 0.7923611111111111 | 0 |
| 0.7930555555555556 | 0 |
| 0.7937500000000001 | 0 |
| 0.7944444444444444 | 0 |
| 0.7951388888888888 | 0 |
| 0.7958333333333334 | 0 |
| 0.7965277777777778 | 0 |
| 0.7972222222222222 | 0 |
| 0.7979166666666666 | 0 |
| 0.7986111111111112 | 0 |
| 0.7993055555555556 | 0 |
| 0.7999999999999999 | 0 |
| 0.8006944444444444 | 0 |
| 0.8013888888888889 | 0 |
| 0.8020833333333334 | 0 |
| 0.8027777777777777 | 0 |
| 0.8034722222222223 | 0 |
| 0.8041666666666667 | 0 |
| 0.8048611111111111 | 0 |
| 0.8055555555555555 | 0 |
| 0.80625 | 0 |
| 0.8069444444444445 | 0 |
| 0.8076388888888889 | 0 |
| 0.8083333333333332 | 0 |
| 0.8090277777777778 | 0 |
| 0.8097222222222222 | 0 |
| 0.8104166666666667 | 0 |
| 0.811111111111111 | 0 |
| 0.8118055555555556 | 0 |
| 0.8125 | 0 |
| 0.8131944444444444 | 0 |
| 0.813888888888889 | 0 |
| 0.8145833333333333 | 0 |
| 0.8152777777777778 | 0 |
| 0.8159722222222222 | 0 |
| 0.8166666666666668 | 0 |
| 0.8173611111111111 | 0 |
| 0.8180555555555555 | 0 |
| 0.81875 | 0 |
| 0.8194444444444445 | 0 |
| 0.8201388888888889 | 0 |
| 0.8208333333333333 | 0 |
| 0.8215277777777777 | 0 |
| 0.8222222222222223 | 0 |
| 0.8229166666666666 | 0 |
| 0.8236111111111111 | 0 |
| 0.8243055555555556 | 0 |
| 0.8250000000000001 | 0 |
| 0.8256944444444444 | 0 |
| 0.8263888888888888 | 0 |
| 0.8270833333333334 | 0 |
| 0.8277777777777778 | 0 |
| 0.8284722222222222 | 0 |
| 0.8291666666666666 | 0 |
| 0.8298611111111112 | 0 |
| 0.8305555555555556 | 0 |
| 0.8312499999999999 | 0 |
| 0.8319444444444444 | 0 |
| 0.8326388888888889 | 0 |
| 0.8333333333333334 | 0 |
| 0.8340277777777777 | 0 |
| 0.8347222222222223 | 0 |
| 0.8354166666666667 | 0 |
| 0.8361111111111111 | 0 |
| 0.8368055555555555 | 0 |
| 0.8375 | 0 |
| 0.8381944444444445 | 0 |
| 0.8388888888888889 | 0 |
| 0.8395833333333332 | 0 |
| 0.8402777777777778 | 0 |
| 0.8409722222222222 | 0 |
| 0.8416666666666667 | 0 |
| 0.842361111111111 | 0 |
| 0.8430555555555556 | 0 |
| 0.84375 | 0 |
| 0.8444444444444444 | 0 |
| 0.845138888888889 | 0 |
| 0.8458333333333333 | 0 |
| 0.8465277777777778 | 0 |
| 0.8472222222222222 | 0 |
| 0.8479166666666668 | 0 |
| 0.8486111111111111 | 0 |
| 0.8493055555555555 | 0 |
| 0.85 | 0 |
| 0.8506944444444445 | 0 |
| 0.8513888888888889 | 0 |
| 0.8520833333333333 | 0 |
| 0.8527777777777777 | 0 |
| 0.8534722222222223 | 0 |
| 0.8541666666666666 | 0 |
| 0.8548611111111111 | 0 |
| 0.8555555555555556 | 0 |
| 0.8562500000000001 | 0 |
| 0.8569444444444444 | 0 |
| 0.8576388888888888 | 0 |
| 0.8583333333333334 | 0 |
| 0.8590277777777778 | 0 |
| 0.8597222222222222 | 0 |
| 0.8604166666666666 | 0 |
| 0.8611111111111112 | 0 |
| 0.8618055555555556 | 0 |
| 0.8624999999999999 | 0 |
| 0.8631944444444444 | 0 |
| 0.8638888888888889 | 0 |
| 0.8645833333333334 | 0 |
| 0.8652777777777777 | 0 |
| 0.8659722222222223 | 0 |
| 0.8666666666666667 | 0 |
| 0.8673611111111111 | 0 |
| 0.8680555555555555 | 0 |
| 0.86875 | 0 |
| 0.8694444444444445 | 0 |
| 0.8701388888888889 | 0 |
| 0.8708333333333332 | 0 |
| 0.8715277777777778 | 0 |
| 0.8722222222222222 | 0 |
| 0.8729166666666667 | 0 |
| 0.873611111111111 | 0 |
| 0.8743055555555556 | 0 |
| 0.875 | 0 |
| 0.8756944444444444 | 0 |
| 0.876388888888889 | 0 |
| 0.8770833333333333 | 0 |
| 0.8777777777777778 | 0 |
| 0.8784722222222222 | 0 |
| 0.8791666666666668 | 0 |
| 0.8798611111111111 | 0 |
| 0.8805555555555555 | 0 |
| 0.88125 | 0 |
| 0.8819444444444445 | 0 |
| 0.8826388888888889 | 0 |
| 0.8833333333333333 | 0 |
| 0.8840277777777777 | 0 |
| 0.8847222222222223 | 0 |
| 0.8854166666666666 | 0 |
| 0.8861111111111111 | 0 |
| 0.8868055555555556 | 0 |
| 0.8875000000000001 | 0 |
| 0.8881944444444444 | 0 |
| 0.8888888888888888 | 0 |
| 0.8895833333333334 | 0 |
| 0.8902777777777778 | 0 |
| 0.8909722222222222 | 0 |
| 0.8916666666666666 | 0 |
| 0.8923611111111112 | 0 |
| 0.8930555555555556 | 0 |
| 0.8937499999999999 | 0 |
| 0.8944444444444444 | 0 |
| 0.8951388888888889 | 0 |
| 0.8958333333333334 | 0 |
| 0.8965277777777777 | 0 |
| 0.8972222222222223 | 0 |
| 0.8979166666666667 | 0 |
| 0.8986111111111111 | 0 |
| 0.8993055555555555 | 0 |
| 0.9 | 0 |
| 0.9006944444444445 | 0 |
| 0.9013888888888889 | 0 |
| 0.9020833333333332 | 0 |
| 0.9027777777777778 | 0 |
| 0.9034722222222222 | 0 |
| 0.9041666666666667 | 0 |
| 0.904861111111111 | 0 |
| 0.9055555555555556 | 0 |
| 0.90625 | 0 |
| 0.9069444444444444 | 0 |
| 0.907638888888889 | 0 |
| 0.9083333333333333 | 0 |
| 0.9090277777777778 | 0 |
| 0.9097222222222222 | 0 |
| 0.9104166666666668 | 0 |
| 0.9111111111111111 | 0 |
| 0.9118055555555555 | 0 |
| 0.9125 | 0 |
| 0.9131944444444445 | 0 |
| 0.9138888888888889 | 0 |
| 0.9145833333333333 | 0 |
| 0.9152777777777777 | 0 |
| 0.9159722222222223 | 0 |
| 0.9166666666666666 | 0 |
| 0.9173611111111111 | 0 |
| 0.9180555555555556 | 0 |
| 0.9187500000000001 | 0 |
| 0.9194444444444444 | 0 |
| 0.9201388888888888 | 0 |
| 0.9208333333333334 | 0 |
| 0.9215277777777778 | 0 |
| 0.9222222222222222 | 0 |
| 0.9229166666666666 | 0 |
| 0.9236111111111112 | 0 |
| 0.9243055555555556 | 0 |
| 0.9249999999999999 | 0 |
| 0.9256944444444444 | 0 |
| 0.9263888888888889 | 0 |
| 0.9270833333333334 | 0 |
| 0.9277777777777777 | 0 |
| 0.9284722222222223 | 0 |
| 0.9291666666666667 | 0 |
| 0.9298611111111111 | 0 |
| 0.9305555555555555 | 0 |
| 0.93125 | 0 |
| 0.9319444444444445 | 0 |
| 0.9326388888888889 | 0 |
| 0.9333333333333332 | 0 |
| 0.9340277777777778 | 0 |
| 0.9347222222222222 | 0 |
| 0.9354166666666667 | 0 |
| 0.936111111111111 | 0 |
| 0.9368055555555556 | 0 |
| 0.9375 | 0 |
| 0.9381944444444444 | 0 |
| 0.938888888888889 | 0 |
| 0.9395833333333333 | 0 |
| 0.9402777777777778 | 0 |
| 0.9409722222222222 | 0 |
| 0.9416666666666668 | 0 |
| 0.9423611111111111 | 0 |
| 0.9430555555555555 | 0 |
| 0.94375 | 0 |
| 0.9444444444444445 | 0 |
| 0.9451388888888889 | 0 |
| 0.9458333333333333 | 0 |
| 0.9465277777777777 | 0 |
| 0.9472222222222223 | 0 |
| 0.9479166666666666 | 0 |
| 0.9486111111111111 | 0 |
| 0.9493055555555556 | 0 |
| 0.9500000000000001 | 0 |
| 0.9506944444444444 | 0 |
| 0.9513888888888888 | 0 |
| 0.9520833333333334 | 0 |
| 0.9527777777777778 | 0 |
| 0.9534722222222222 | 0 |
| 0.9541666666666666 | 0 |
| 0.9548611111111112 | 0 |
| 0.9555555555555556 | 0 |
| 0.9562499999999999 | 0 |
| 0.9569444444444444 | 0 |
| 0.9576388888888889 | 0 |
| 0.9583333333333334 | 0 |
| 0.9590277777777777 | 0 |
| 0.9597222222222223 | 0 |
| 0.9604166666666667 | 0 |
| 0.9611111111111111 | 0 |
| 0.9618055555555555 | 0 |
| 0.9625 | 0 |
| 0.9631944444444445 | 0 |
| 0.9638888888888889 | 0 |
| 0.9645833333333332 | 0 |
| 0.9652777777777778 | 0 |
| 0.9659722222222222 | 0 |
| 0.9666666666666667 | 0 |
| 0.967361111111111 | 0 |
| 0.9680555555555556 | 0 |
| 0.96875 | 0 |
| 0.9694444444444444 | 0 |
| 0.970138888888889 | 0 |
| 0.9708333333333333 | 0 |
| 0.9715277777777778 | 0 |
| 0.9722222222222222 | 0 |
| 0.9729166666666668 | 0 |
| 0.9736111111111111 | 0 |
| 0.9743055555555555 | 0 |
| 0.975 | 0 |
| 0.9756944444444445 | 0 |
| 0.9763888888888889 | 0 |
| 0.9770833333333333 | 0 |
| 0.9777777777777777 | 0 |
| 0.9784722222222223 | 0 |
| 0.9791666666666666 | 0 |
| 0.9798611111111111 | 0 |
| 0.9805555555555556 | 0 |
| 0.9812500000000001 | 0 |
| 0.9819444444444444 | 0 |
| 0.9826388888888888 | 0 |
| 0.9833333333333334 | 0 |
| 0.9840277777777778 | 0 |
| 0.9847222222222222 | 0 |
| 0.9854166666666666 | 0 |
| 0.9861111111111112 | 0 |
| 0.9868055555555556 | 0 |
| 0.9874999999999999 | 0 |
| 0.9881944444444444 | 0 |
| 0.9888888888888889 | 0 |
| 0.9895833333333334 | 0 |
| 0.9902777777777777 | 0 |
| 0.9909722222222223 | 0 |
| 0.9916666666666667 | 0 |
| 0.9923611111111111 | 0 |
| 0.9930555555555555 | 0 |
| 0.99375 | 0 |
| 0.9944444444444445 | 0 |
| 0.9951388888888889 | 0 |
| 0.9958333333333332 | 0 |
| 0.9965277777777778 | 0 |
| 0.9972222222222222 | 0 |
| 0.9979166666666667 | 0 |
| 0.998611111111111 | 0 |
| 0.9993055555555556 | 0 |